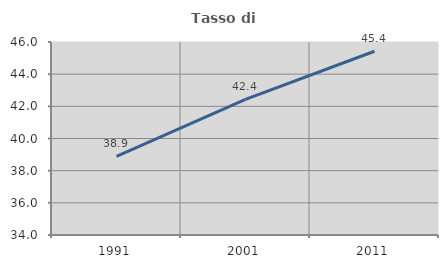
| Category | Tasso di occupazione   |
|---|---|
| 1991.0 | 38.889 |
| 2001.0 | 42.437 |
| 2011.0 | 45.426 |